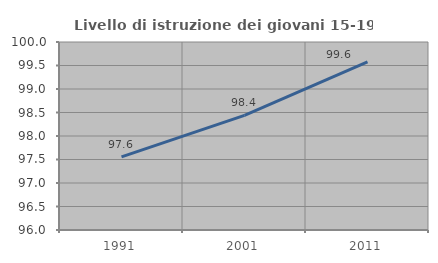
| Category | Livello di istruzione dei giovani 15-19 anni |
|---|---|
| 1991.0 | 97.557 |
| 2001.0 | 98.44 |
| 2011.0 | 99.579 |